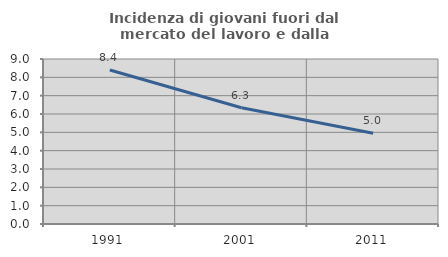
| Category | Incidenza di giovani fuori dal mercato del lavoro e dalla formazione  |
|---|---|
| 1991.0 | 8.397 |
| 2001.0 | 6.338 |
| 2011.0 | 4.95 |